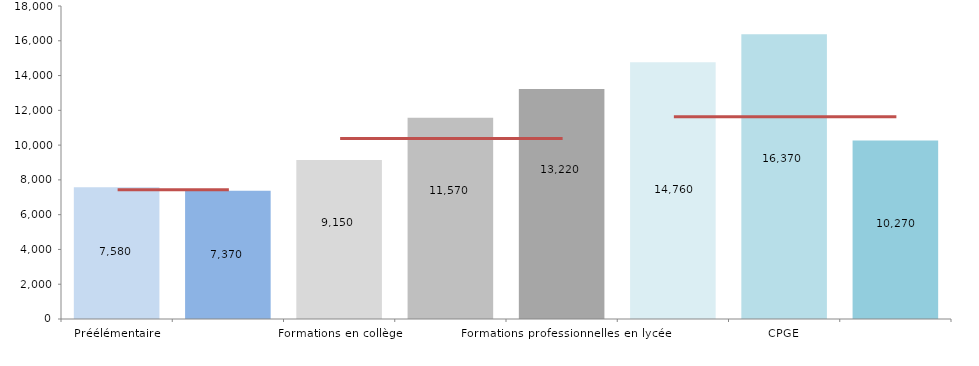
| Category | Series 0 |
|---|---|
| Préélémentaire | 7580 |
| Élémentaire | 7370 |
| Formations en collège | 9150 |
| Formations générales et technologiques en lycée | 11570 |
| Formations professionnelles en lycée | 13220 |
| STS | 14760 |
| CPGE | 16370 |
| Universités  | 10270 |